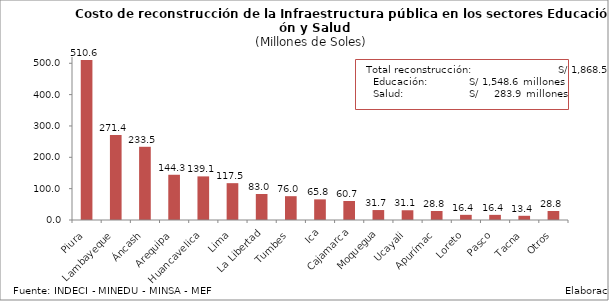
| Category | Series 0 |
|---|---|
| Piura | 510.619 |
| Lambayeque | 271.409 |
| Áncash | 233.54 |
| Arequipa | 144.319 |
| Huancavelica | 139.113 |
| Lima | 117.503 |
| La Libertad | 82.988 |
| Tumbes | 75.97 |
| Ica | 65.801 |
| Cajamarca | 60.663 |
| Moquegua | 31.739 |
| Ucayali | 31.083 |
| Apurímac | 28.786 |
| Loreto | 16.45 |
| Pasco | 16.366 |
| Tacna | 13.398 |
| Otros | 28.752 |